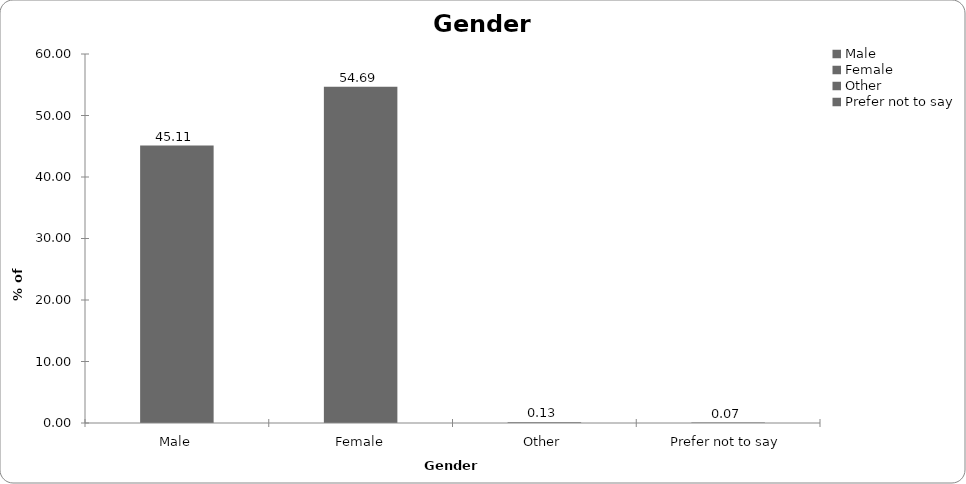
| Category | Gender |
|---|---|
| Male | 45.108 |
| Female | 54.695 |
| Other | 0.131 |
| Prefer not to say | 0.066 |